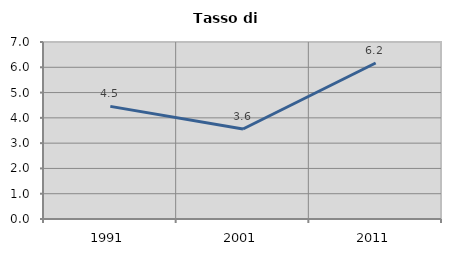
| Category | Tasso di disoccupazione   |
|---|---|
| 1991.0 | 4.454 |
| 2001.0 | 3.56 |
| 2011.0 | 6.171 |